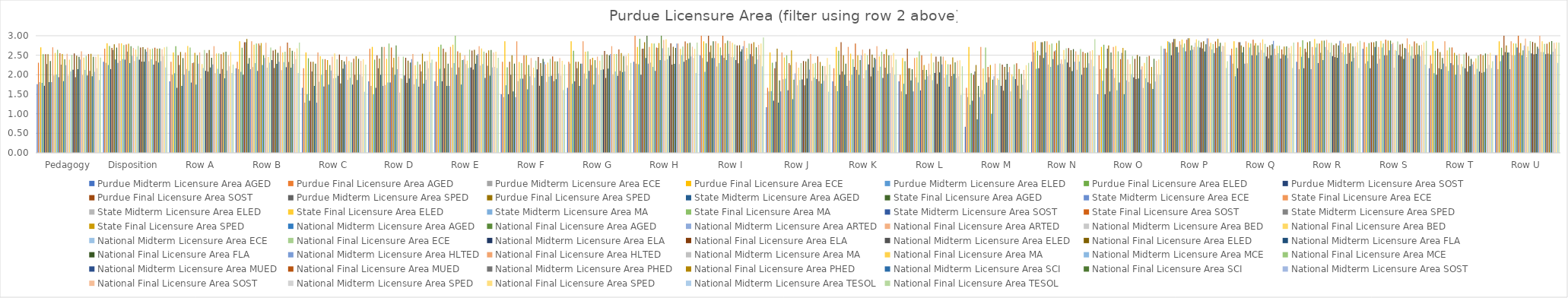
| Category | Purdue | State | National |
|---|---|---|---|
| Pedagogy | 2.526 | 2.534 | 2.438 |
| Disposition | 2.781 | 2.797 | 2.717 |
| Row A | 2.583 | 2.562 | 2.261 |
| Row B | 2.917 | 2.812 | 2.826 |
| Row C | 2.333 | 2.375 | 2.261 |
| Row D | 2.417 | 2.438 | 2.391 |
| Row E | 2.583 | 2.562 | 2.435 |
| Row F | 2.5 | 2.5 | 2.261 |
| Row G | 2.333 | 2.438 | 2.304 |
| Row H | 2.833 | 2.812 | 2.826 |
| Row I | 2.75 | 2.812 | 2.956 |
| Row J | 2.667 | 2.625 | 2.261 |
| Row K | 2.5 | 2.5 | 2.391 |
| Row L | 2.167 | 2.25 | 2.217 |
| Row M | 2.25 | 2.25 | 2.304 |
| Row N | 2.833 | 2.812 | 2.913 |
| Row O | 2.75 | 2.688 | 2.739 |
| Row P | 2.917 | 2.938 | 2.348 |
| Row Q | 2.75 | 2.812 | 2.826 |
| Row R | 2.833 | 2.875 | 2.87 |
| Row S | 2.833 | 2.875 | 2.87 |
| Row T | 2.583 | 2.562 | 2.348 |
| Row U | 2.75 | 2.812 | 2.826 |